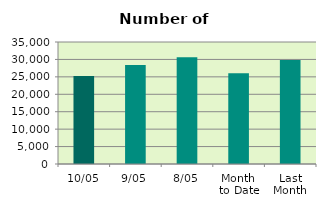
| Category | Series 0 |
|---|---|
| 10/05 | 25248 |
| 9/05 | 28432 |
| 8/05 | 30614 |
| Month 
to Date | 26052 |
| Last
Month | 29833 |